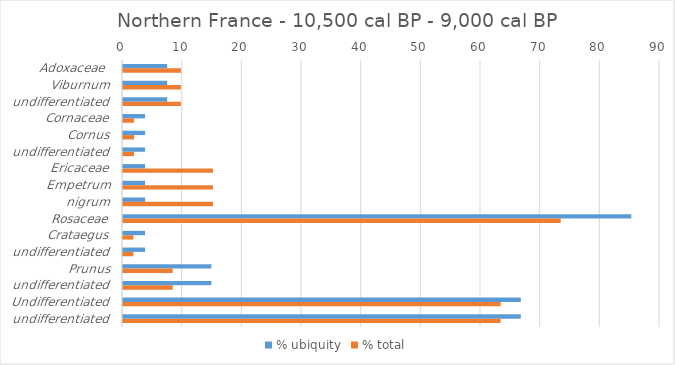
| Category | % ubiquity | % total |
|---|---|---|
| Adoxaceae  | 7.407 | 9.701 |
| Viburnum | 7.407 | 9.701 |
| undifferentiated | 7.407 | 9.701 |
| Cornaceae | 3.704 | 1.855 |
| Cornus | 3.704 | 1.855 |
| undifferentiated | 3.704 | 1.855 |
| Ericaceae | 3.704 | 15.09 |
| Empetrum | 3.704 | 15.09 |
| nigrum | 3.704 | 15.09 |
| Rosaceae | 85.185 | 73.354 |
| Crataegus | 3.704 | 1.73 |
| undifferentiated | 3.704 | 1.73 |
| Prunus | 14.815 | 8.332 |
| undifferentiated | 14.815 | 8.332 |
| Undifferentiated | 66.667 | 63.293 |
| undifferentiated | 66.667 | 63.293 |